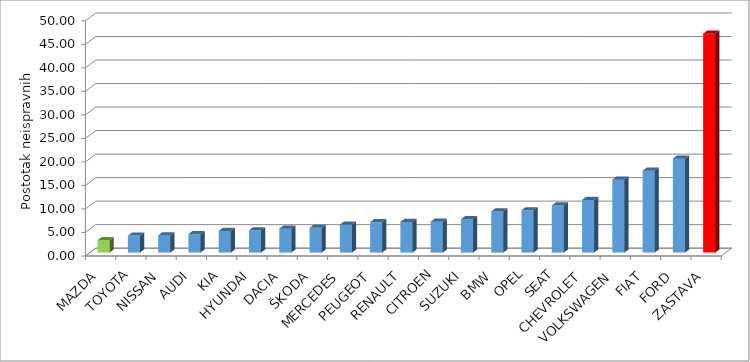
| Category | Series 4 |
|---|---|
| MAZDA | 2.628 |
| TOYOTA | 3.61 |
| NISSAN | 3.652 |
| AUDI | 3.933 |
| KIA | 4.591 |
| HYUNDAI | 4.735 |
| DACIA | 5.075 |
| ŠKODA | 5.263 |
| MERCEDES | 5.94 |
| PEUGEOT | 6.475 |
| RENAULT | 6.497 |
| CITROEN | 6.565 |
| SUZUKI | 7.092 |
| BMW | 8.735 |
| OPEL | 8.992 |
| SEAT | 10.007 |
| CHEVROLET | 11.179 |
| VOLKSWAGEN | 15.493 |
| FIAT | 17.403 |
| FORD | 19.967 |
| ZASTAVA | 46.545 |